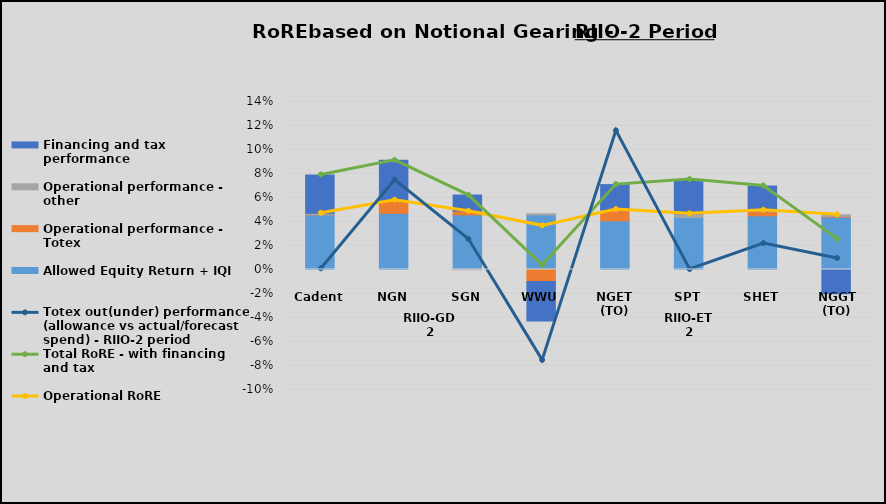
| Category | Allowed Equity Return + IQI | Operational performance - Totex | Operational performance - other | Financing and tax performance |
|---|---|---|---|---|
| 0 | 0.046 | 0 | 0.001 | 0.032 |
| 1 | 0.047 | 0.01 | 0.001 | 0.033 |
| 2 | 0.046 | 0.003 | 0 | 0.013 |
| 3 | 0.046 | -0.01 | 0.001 | -0.033 |
| 4 | 0.041 | 0.009 | 0 | 0.021 |
| 5 | 0.043 | 0 | 0.003 | 0.029 |
| 6 | 0.045 | 0.004 | 0.001 | 0.02 |
| 7 | 0.044 | 0.001 | 0.001 | -0.02 |